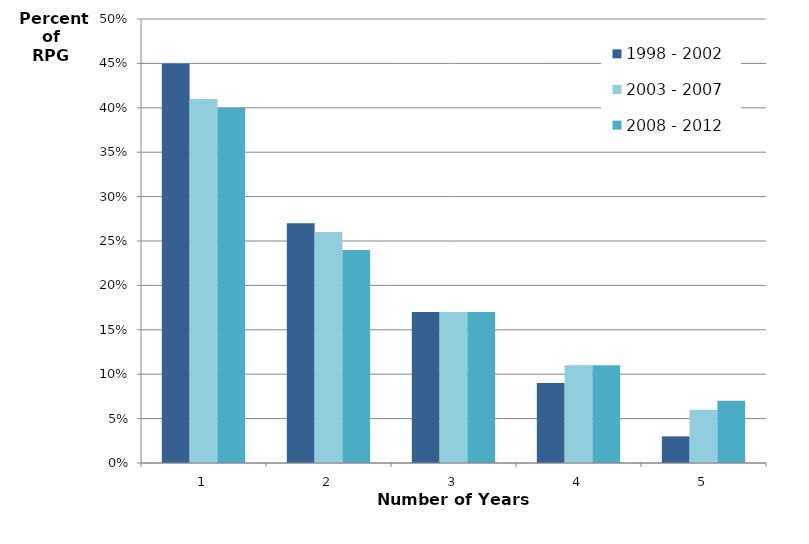
| Category | 1998 - 2002 | 2003 - 2007 | 2008 - 2012 |
|---|---|---|---|
| 0 | 0.45 | 0.41 | 0.4 |
| 1 | 0.27 | 0.26 | 0.24 |
| 2 | 0.17 | 0.17 | 0.17 |
| 3 | 0.09 | 0.11 | 0.11 |
| 4 | 0.03 | 0.06 | 0.07 |